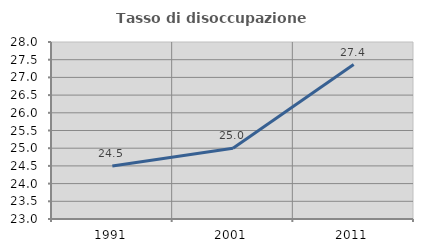
| Category | Tasso di disoccupazione giovanile  |
|---|---|
| 1991.0 | 24.5 |
| 2001.0 | 25 |
| 2011.0 | 27.363 |